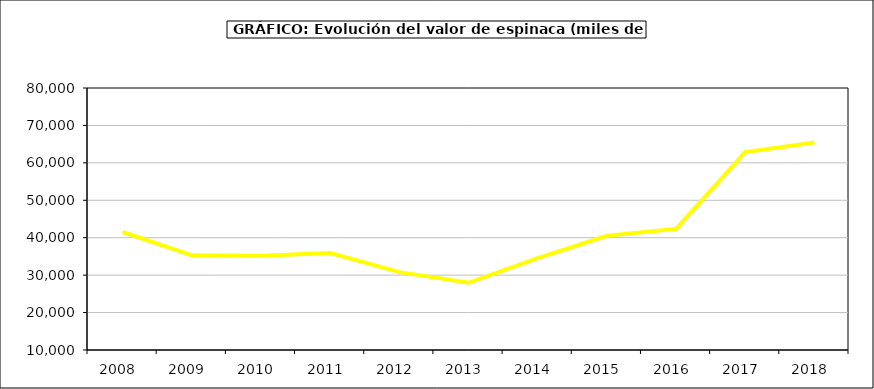
| Category | Valor |
|---|---|
| 2008.0 | 41526.143 |
| 2009.0 | 35291.496 |
| 2010.0 | 35154.695 |
| 2011.0 | 35899.468 |
| 2012.0 | 30801.916 |
| 2013.0 | 27951.792 |
| 2014.0 | 34558.726 |
| 2015.0 | 40502 |
| 2016.0 | 42355 |
| 2017.0 | 62868.236 |
| 2018.0 | 65435.978 |